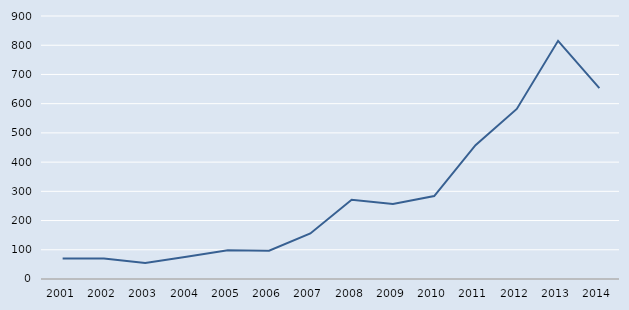
| Category | Series 0 |
|---|---|
| 2001.0 | 70 |
| 2002.0 | 70 |
| 2003.0 | 55 |
| 2004.0 | 76 |
| 2005.0 | 98 |
| 2006.0 | 97 |
| 2007.0 | 156 |
| 2008.0 | 271 |
| 2009.0 | 257 |
| 2010.0 | 284 |
| 2011.0 | 458 |
| 2012.0 | 582 |
| 2013.0 | 815 |
| 2014.0 | 653 |